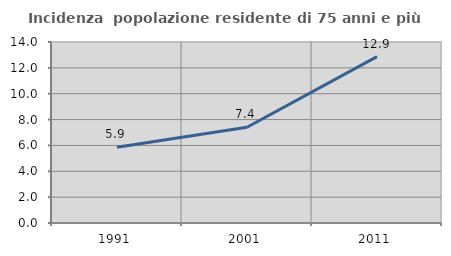
| Category | Incidenza  popolazione residente di 75 anni e più |
|---|---|
| 1991.0 | 5.86 |
| 2001.0 | 7.403 |
| 2011.0 | 12.866 |